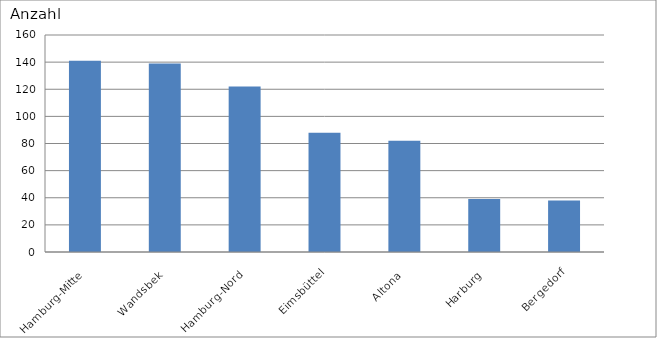
| Category | Hamburg-Mitte Wandsbek Hamburg-Nord Eimsbüttel Altona Harburg Bergedorf |
|---|---|
| Hamburg-Mitte | 141 |
| Wandsbek | 139 |
| Hamburg-Nord | 122 |
| Eimsbüttel | 88 |
| Altona | 82 |
| Harburg | 39 |
| Bergedorf | 38 |